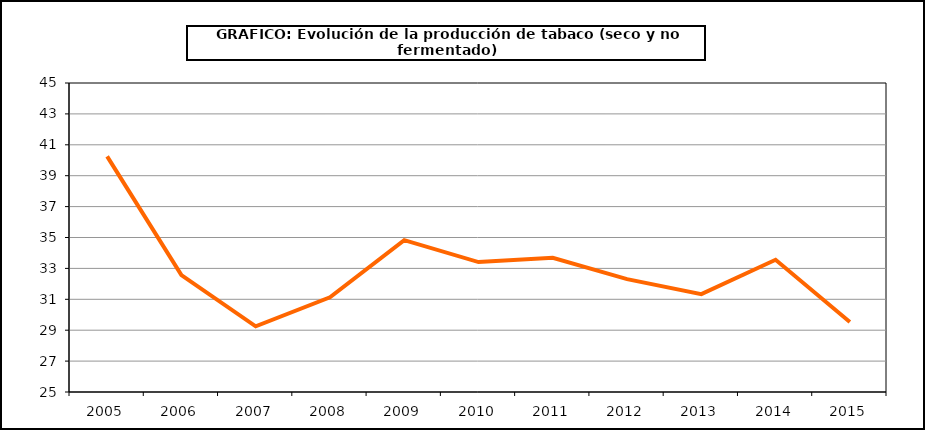
| Category | Producción |
|---|---|
| 2005.0 | 40.251 |
| 2006.0 | 32.563 |
| 2007.0 | 29.248 |
| 2008.0 | 31.127 |
| 2009.0 | 34.827 |
| 2010.0 | 33.41 |
| 2011.0 | 33.692 |
| 2012.0 | 32.308 |
| 2013.0 | 31.333 |
| 2014.0 | 33.557 |
| 2015.0 | 29.534 |